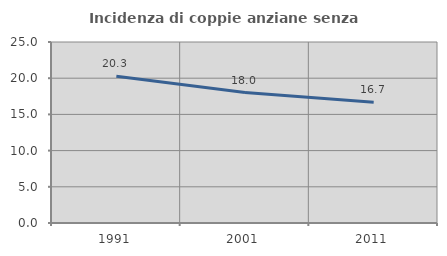
| Category | Incidenza di coppie anziane senza figli  |
|---|---|
| 1991.0 | 20.264 |
| 2001.0 | 18.009 |
| 2011.0 | 16.667 |